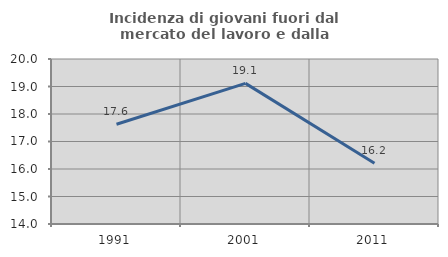
| Category | Incidenza di giovani fuori dal mercato del lavoro e dalla formazione  |
|---|---|
| 1991.0 | 17.629 |
| 2001.0 | 19.113 |
| 2011.0 | 16.208 |